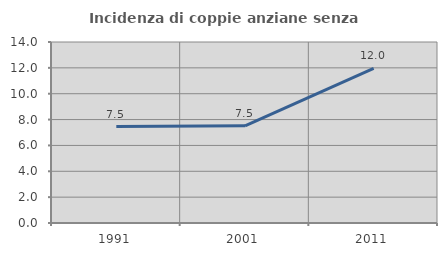
| Category | Incidenza di coppie anziane senza figli  |
|---|---|
| 1991.0 | 7.461 |
| 2001.0 | 7.516 |
| 2011.0 | 11.966 |